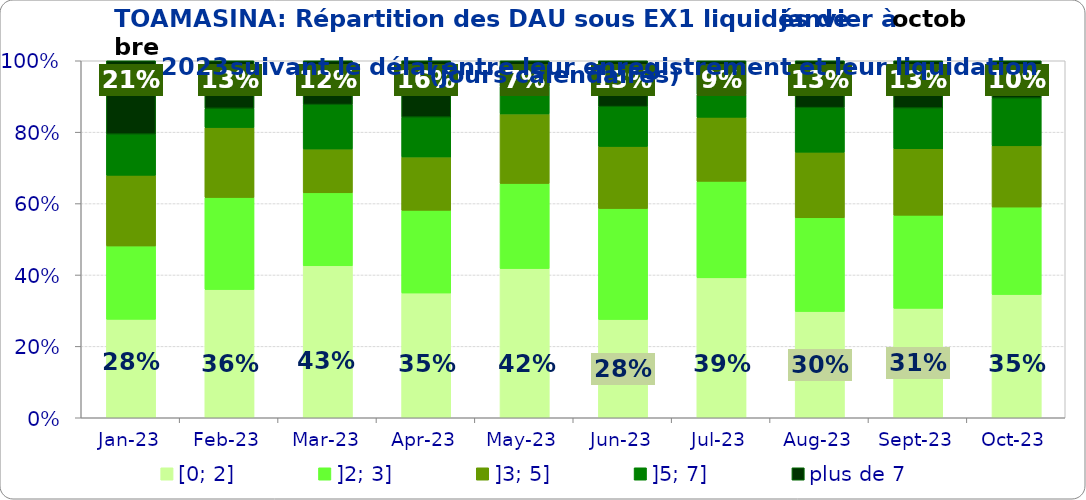
| Category | [0; 2] | ]2; 3] | ]3; 5] | ]5; 7] | plus de 7 |
|---|---|---|---|---|---|
| 2023-01-01 | 0.276 | 0.206 | 0.198 | 0.115 | 0.206 |
| 2023-02-01 | 0.359 | 0.258 | 0.196 | 0.054 | 0.133 |
| 2023-03-01 | 0.426 | 0.204 | 0.123 | 0.125 | 0.123 |
| 2023-04-01 | 0.349 | 0.232 | 0.149 | 0.112 | 0.158 |
| 2023-05-01 | 0.418 | 0.239 | 0.195 | 0.076 | 0.073 |
| 2023-06-01 | 0.275 | 0.311 | 0.174 | 0.111 | 0.128 |
| 2023-07-01 | 0.392 | 0.27 | 0.18 | 0.064 | 0.095 |
| 2023-08-01 | 0.298 | 0.263 | 0.184 | 0.125 | 0.131 |
| 2023-09-01 | 0.306 | 0.261 | 0.186 | 0.114 | 0.133 |
| 2023-10-01 | 0.345 | 0.245 | 0.171 | 0.134 | 0.105 |